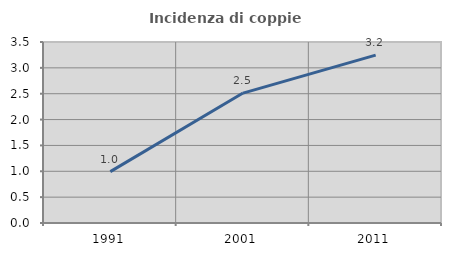
| Category | Incidenza di coppie miste |
|---|---|
| 1991.0 | 0.993 |
| 2001.0 | 2.512 |
| 2011.0 | 3.247 |